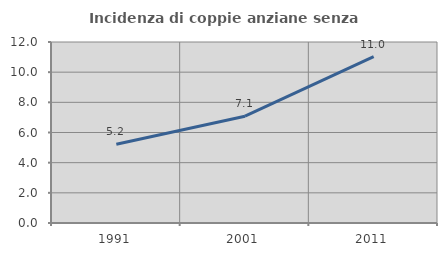
| Category | Incidenza di coppie anziane senza figli  |
|---|---|
| 1991.0 | 5.22 |
| 2001.0 | 7.083 |
| 2011.0 | 11.034 |